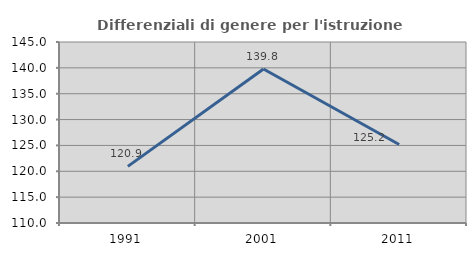
| Category | Differenziali di genere per l'istruzione superiore |
|---|---|
| 1991.0 | 120.944 |
| 2001.0 | 139.776 |
| 2011.0 | 125.17 |